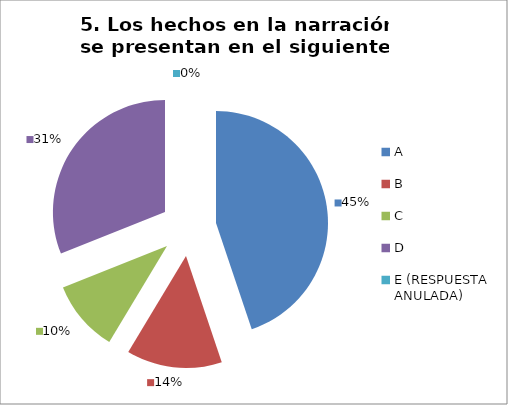
| Category | CANTIDAD DE RESPUESTAS PREGUNTA (5) | PORCENTAJE |
|---|---|---|
| A | 13 | 0.448 |
| B | 4 | 0.138 |
| C | 3 | 0.103 |
| D | 9 | 0.31 |
| E (RESPUESTA ANULADA) | 0 | 0 |